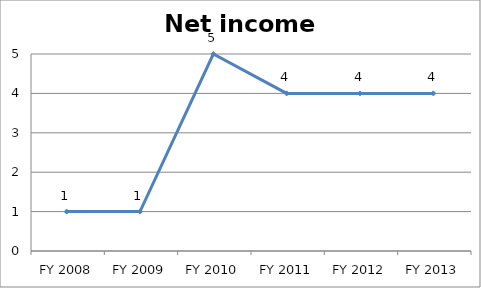
| Category | Net income score |
|---|---|
| FY 2013 | 4 |
| FY 2012 | 4 |
| FY 2011 | 4 |
| FY 2010 | 5 |
| FY 2009 | 1 |
| FY 2008 | 1 |